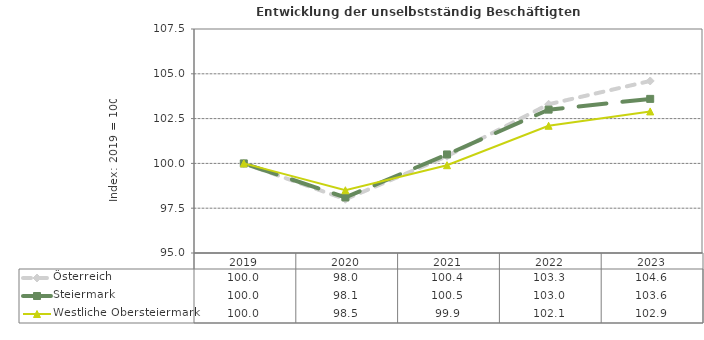
| Category | Österreich | Steiermark | Westliche Obersteiermark |
|---|---|---|---|
| 2023.0 | 104.6 | 103.6 | 102.9 |
| 2022.0 | 103.3 | 103 | 102.1 |
| 2021.0 | 100.4 | 100.5 | 99.9 |
| 2020.0 | 98 | 98.1 | 98.5 |
| 2019.0 | 100 | 100 | 100 |